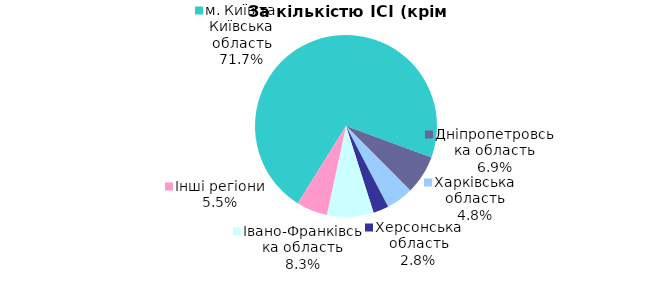
| Category | Series 0 |
|---|---|
| м. Київ та Київська область | 0.717 |
| Дніпропетровська область | 0.069 |
| Харківська область | 0.048 |
| Херсонська область | 0.028 |
| Iвано-Франкiвська область | 0.083 |
| Інші регіони | 0.055 |